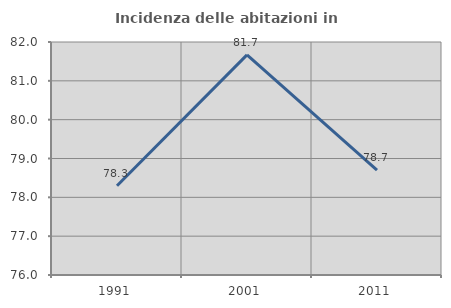
| Category | Incidenza delle abitazioni in proprietà  |
|---|---|
| 1991.0 | 78.297 |
| 2001.0 | 81.668 |
| 2011.0 | 78.7 |